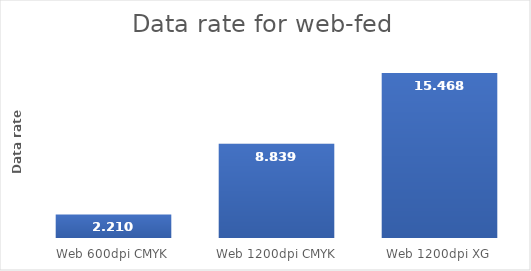
| Category | Series 0 |
|---|---|
| Web 600dpi CMYK | 2.21 |
| Web 1200dpi CMYK | 8.839 |
| Web 1200dpi XG | 15.468 |